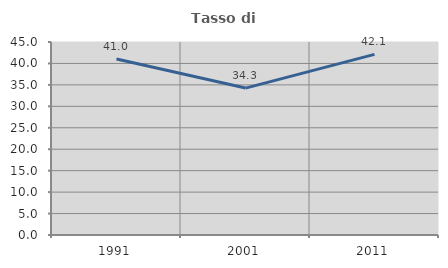
| Category | Tasso di occupazione   |
|---|---|
| 1991.0 | 41.026 |
| 2001.0 | 34.254 |
| 2011.0 | 42.105 |